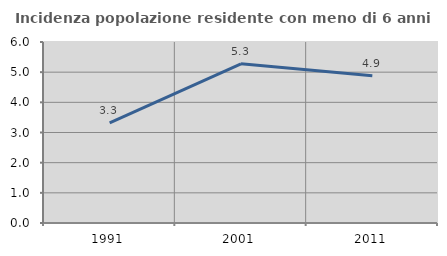
| Category | Incidenza popolazione residente con meno di 6 anni |
|---|---|
| 1991.0 | 3.32 |
| 2001.0 | 5.277 |
| 2011.0 | 4.884 |